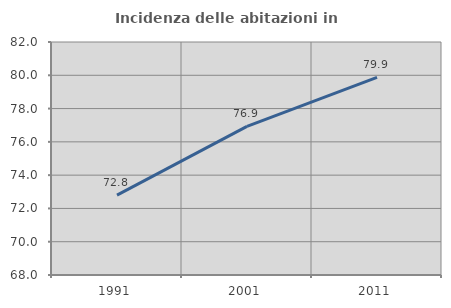
| Category | Incidenza delle abitazioni in proprietà  |
|---|---|
| 1991.0 | 72.796 |
| 2001.0 | 76.931 |
| 2011.0 | 79.874 |